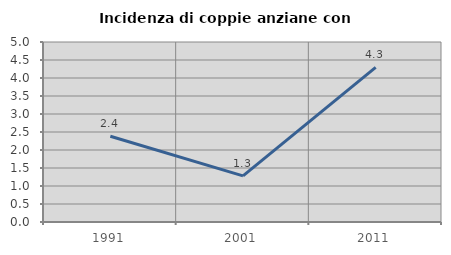
| Category | Incidenza di coppie anziane con figli |
|---|---|
| 1991.0 | 2.381 |
| 2001.0 | 1.282 |
| 2011.0 | 4.294 |